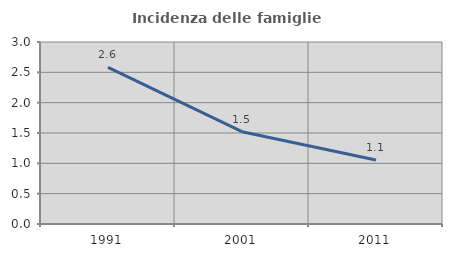
| Category | Incidenza delle famiglie numerose |
|---|---|
| 1991.0 | 2.581 |
| 2001.0 | 1.521 |
| 2011.0 | 1.056 |